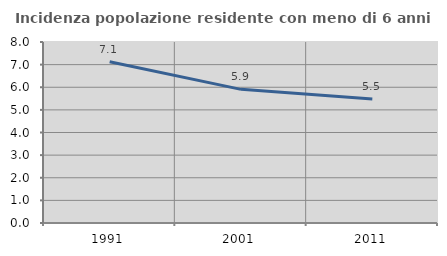
| Category | Incidenza popolazione residente con meno di 6 anni |
|---|---|
| 1991.0 | 7.129 |
| 2001.0 | 5.907 |
| 2011.0 | 5.486 |